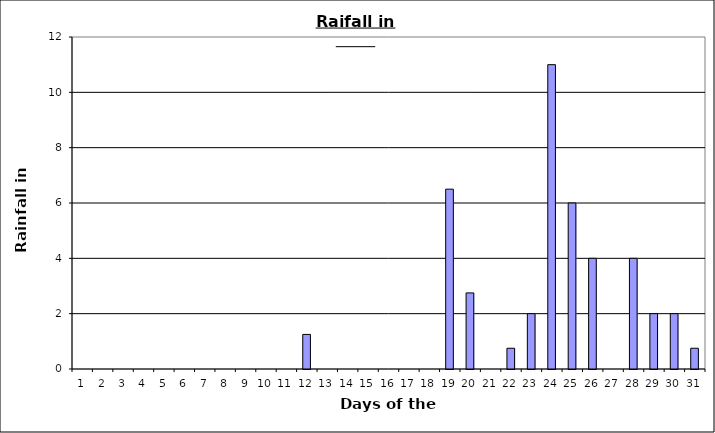
| Category | Series 0 |
|---|---|
| 0 | 0 |
| 1 | 0 |
| 2 | 0 |
| 3 | 0 |
| 4 | 0 |
| 5 | 0 |
| 6 | 0 |
| 7 | 0 |
| 8 | 0 |
| 9 | 0 |
| 10 | 0 |
| 11 | 1.25 |
| 12 | 0 |
| 13 | 0 |
| 14 | 0 |
| 15 | 0 |
| 16 | 0 |
| 17 | 0 |
| 18 | 6.5 |
| 19 | 2.75 |
| 20 | 0 |
| 21 | 0.75 |
| 22 | 2 |
| 23 | 11 |
| 24 | 6 |
| 25 | 4 |
| 26 | 0 |
| 27 | 4 |
| 28 | 2 |
| 29 | 2 |
| 30 | 0.75 |